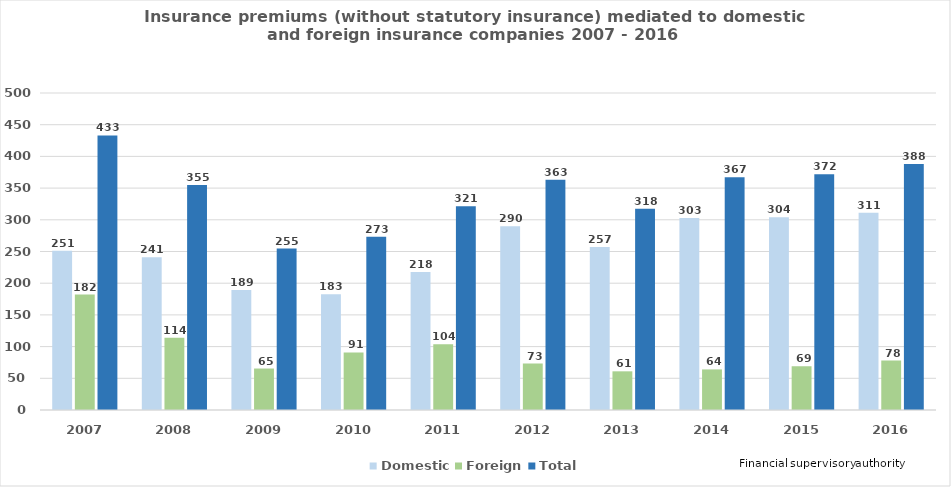
| Category | Domestic | Foreign | Total |
|---|---|---|---|
| 2007.0 | 251 | 182 | 433 |
| 2008.0 | 241 | 114 | 355 |
| 2009.0 | 189.249 | 65.417 | 254.666 |
| 2010.0 | 182.562 | 90.729 | 273.291 |
| 2011.0 | 217.55 | 103.894 | 321.444 |
| 2012.0 | 289.922 | 73.321 | 363.243 |
| 2013.0 | 257 | 61 | 317.523 |
| 2014.0 | 303 | 64 | 367 |
| 2015.0 | 304 | 69 | 372 |
| 2016.0 | 311 | 78 | 388 |